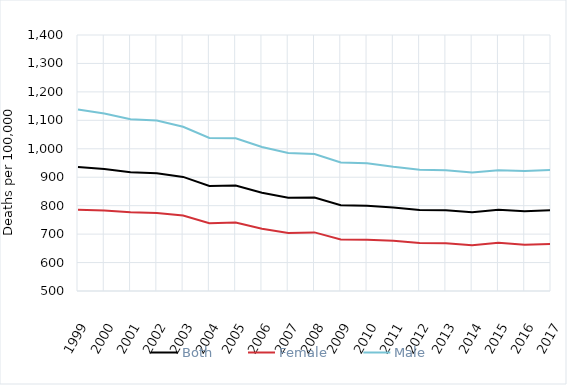
| Category | Both | Female | Male |
|---|---|---|---|
| 1999.0 | 935.85 | 785.978 | 1138.179 |
| 2000.0 | 928.688 | 783.054 | 1124.053 |
| 2001.0 | 917.625 | 776.802 | 1104.134 |
| 2002.0 | 914.213 | 774.16 | 1099.132 |
| 2003.0 | 901.044 | 765.381 | 1077.317 |
| 2004.0 | 869.018 | 738.57 | 1037.955 |
| 2005.0 | 870.597 | 740.483 | 1036.809 |
| 2006.0 | 845.704 | 718.925 | 1006.382 |
| 2007.0 | 828.261 | 703.763 | 985.028 |
| 2008.0 | 828.412 | 706.001 | 981.401 |
| 2009.0 | 801.368 | 681.119 | 952.044 |
| 2010.0 | 799.46 | 679.814 | 949.03 |
| 2011.0 | 793.364 | 677.083 | 936.41 |
| 2012.0 | 784.751 | 669.076 | 926.281 |
| 2013.0 | 784.062 | 668.11 | 924.853 |
| 2014.0 | 776.562 | 660.988 | 916.221 |
| 2015.0 | 785.597 | 669.322 | 924.504 |
| 2016.0 | 780.79 | 662.257 | 921.716 |
| 2017.0 | 784.283 | 664.899 | 925.43 |